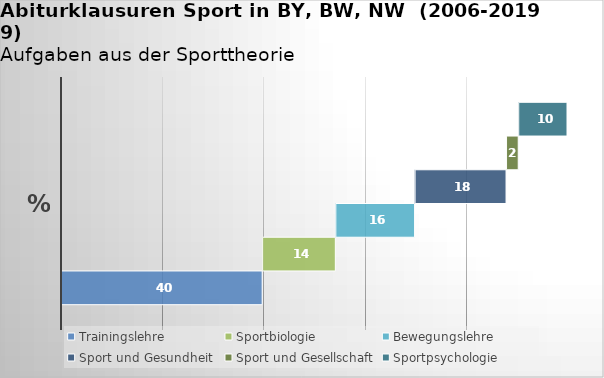
| Category | Trainingslehre | Sportbiologie | Bewegungslehre | Sport und Gesundheit | Sport und Gesellschaft | Sportpsychologie |
|---|---|---|---|---|---|---|
| % | 39.759 | 14.458 | 15.663 | 18.072 | 2.41 | 9.639 |